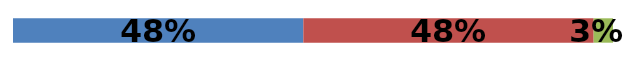
| Category | Series 0 | Series 1 | Series 2 |
|---|---|---|---|
| 0 | 0.484 | 0.484 | 0.032 |